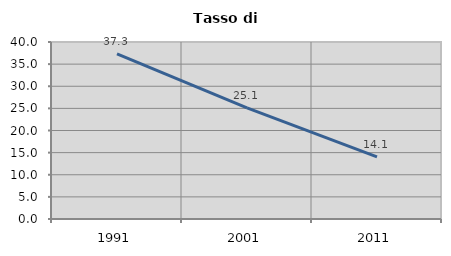
| Category | Tasso di disoccupazione   |
|---|---|
| 1991.0 | 37.315 |
| 2001.0 | 25.11 |
| 2011.0 | 14.058 |